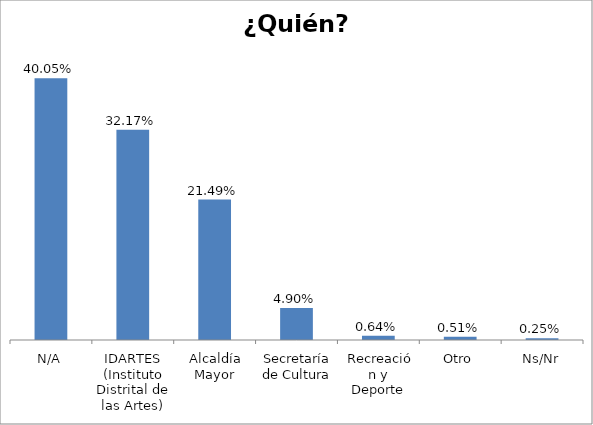
| Category | Total |
|---|---|
| N/A | 0.401 |
| IDARTES (Instituto Distrital de las Artes) | 0.322 |
| Alcaldía Mayor | 0.215 |
| Secretaría de Cultura, Recreación y Deporte | 0.049 |
| Otro | 0.006 |
| Ns/Nr | 0.005 |
| Orquesta Filarmónica de Bogotá | 0.003 |